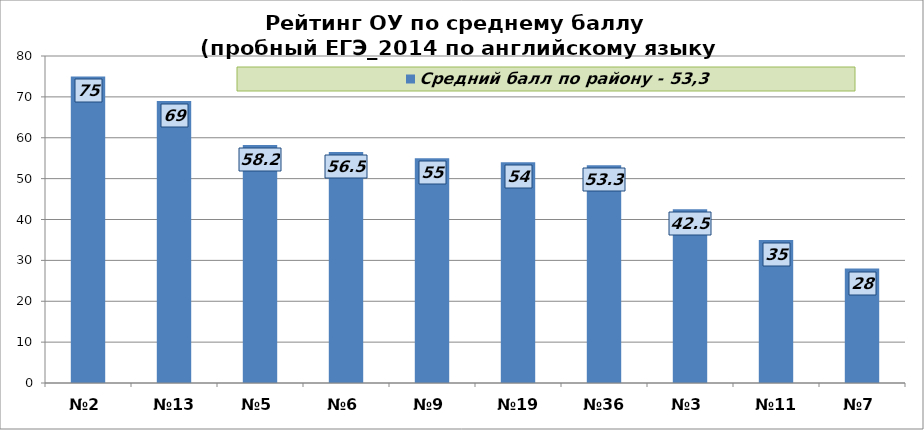
| Category | Средний балл по району - 53,3 |
|---|---|
| №2 | 75 |
| №13 | 69 |
| №5 | 58.2 |
| №6 | 56.5 |
| №9 | 55 |
| №19 | 54 |
| №36 | 53.3 |
| №3 | 42.5 |
| №11 | 35 |
| №7 | 28 |